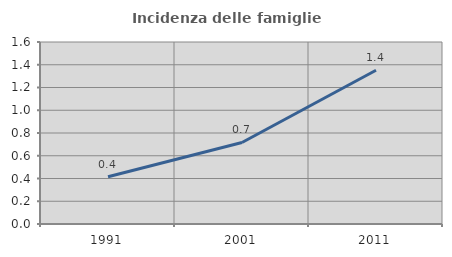
| Category | Incidenza delle famiglie numerose |
|---|---|
| 1991.0 | 0.415 |
| 2001.0 | 0.717 |
| 2011.0 | 1.351 |